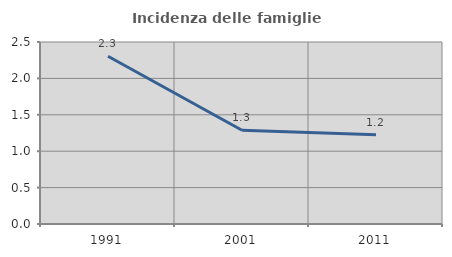
| Category | Incidenza delle famiglie numerose |
|---|---|
| 1991.0 | 2.305 |
| 2001.0 | 1.288 |
| 2011.0 | 1.224 |